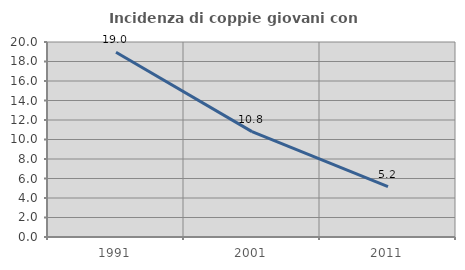
| Category | Incidenza di coppie giovani con figli |
|---|---|
| 1991.0 | 18.953 |
| 2001.0 | 10.811 |
| 2011.0 | 5.169 |